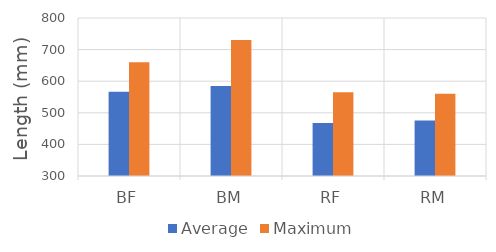
| Category | Average | Maximum |
|---|---|---|
| BF | 567 | 660 |
| BM | 585 | 730 |
| RF | 468 | 565 |
| RM | 476 | 560 |